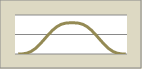
| Category | Series 1 |
|---|---|
| 0.0 | 0 |
| 0.0006 | 0.005 |
| 0.0012 | 0.041 |
| 0.0018 | 0.13 |
| 0.0024 | 0.282 |
| 0.0029999999999999996 | 0.49 |
| 0.0035999999999999995 | 0.736 |
| 0.0042 | 0.99 |
| 0.0048 | 1.22 |
| 0.005399999999999999 | 1.402 |
| 0.005999999999999999 | 1.522 |
| 0.006599999999999999 | 1.582 |
| 0.007199999999999999 | 1.599 |
| 0.007799999999999999 | 1.599 |
| 0.0084 | 1.582 |
| 0.009 | 1.522 |
| 0.0096 | 1.402 |
| 0.010199999999999999 | 1.22 |
| 0.010799999999999999 | 0.99 |
| 0.011399999999999999 | 0.736 |
| 0.011999999999999999 | 0.49 |
| 0.012599999999999998 | 0.282 |
| 0.013199999999999998 | 0.13 |
| 0.013799999999999998 | 0.041 |
| 0.014399999999999998 | 0.005 |
| 0.014999999999999998 | 0 |